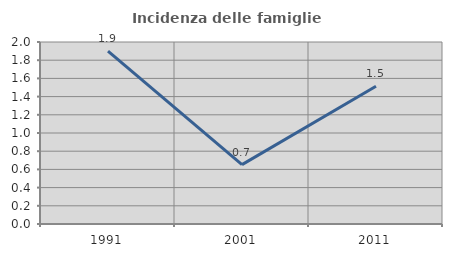
| Category | Incidenza delle famiglie numerose |
|---|---|
| 1991.0 | 1.899 |
| 2001.0 | 0.653 |
| 2011.0 | 1.514 |